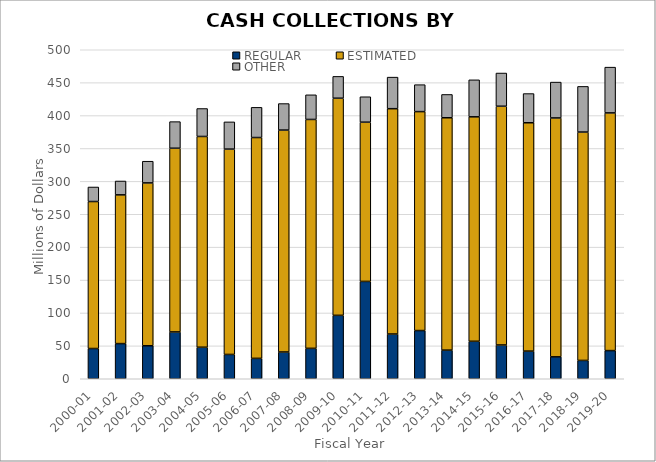
| Category | REGULAR | ESTIMATED | OTHER |
|---|---|---|---|
| 2000-01 | 45.961 | 223.381 | 22.079 |
| 2001-02 | 53.43 | 226.045 | 21.08 |
| 2002-03 | 50.156 | 247.479 | 32.974 |
| 2003-04 | 71.153 | 279.18 | 40.434 |
| 2004-05 | 47.898 | 320.33 | 42.472 |
| 2005-06 | 36.945 | 312.057 | 41.369 |
| 2006-07 | 30.99 | 335.61 | 45.89 |
| 2007-08 | 40.655 | 337.282 | 40.292 |
| 2008-09 | 46.228 | 347.858 | 37.449 |
| 2009-10 | 96.371 | 329.988 | 33.17 |
| 2010-11 | 147.921 | 242 | 38.673 |
| 2011-12 | 67.989 | 342.457 | 47.962 |
| 2012-13 | 73.281 | 332.719 | 40.947 |
| 2013-14 | 43.51 | 353.125 | 35.438 |
| 2014-15 | 56.952 | 341.119 | 56.236 |
| 2015-16 | 51.342 | 362.824 | 50.46 |
| 2016-17 | 42.017 | 347.03 | 44.378 |
| 2017-18 | 33.297 | 363.072 | 54.488 |
| 2018-19 | 27.847 | 347.081 | 69.375 |
| 2019-20 | 42.809 | 361.23 | 69.54 |